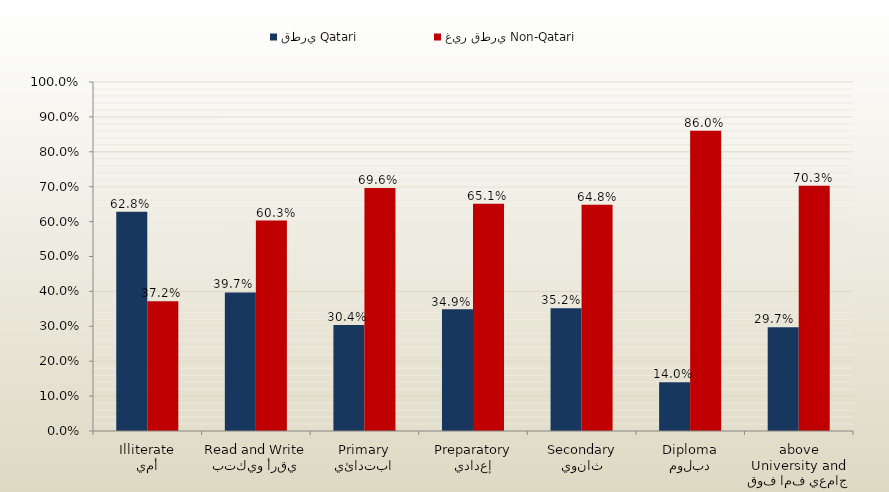
| Category | قطري Qatari | غير قطري Non-Qatari |
|---|---|---|
| أمي
Illiterate | 0.628 | 0.372 |
| يقرأ ويكتب
Read and Write | 0.397 | 0.603 |
| ابتدائي
Primary | 0.304 | 0.696 |
| إعدادي
Preparatory | 0.349 | 0.651 |
| ثانوي
Secondary | 0.352 | 0.648 |
| دبلوم
Diploma | 0.14 | 0.86 |
| جامعي فما فوق
University and above | 0.297 | 0.703 |